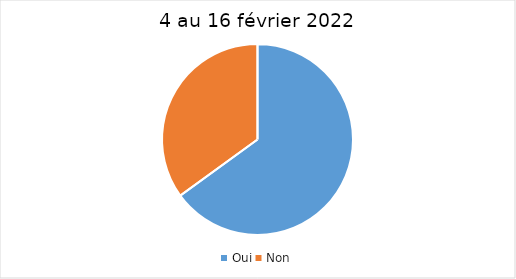
| Category | 4 au 16 février 2022 |
|---|---|
| Oui | 65 |
| Non | 35 |